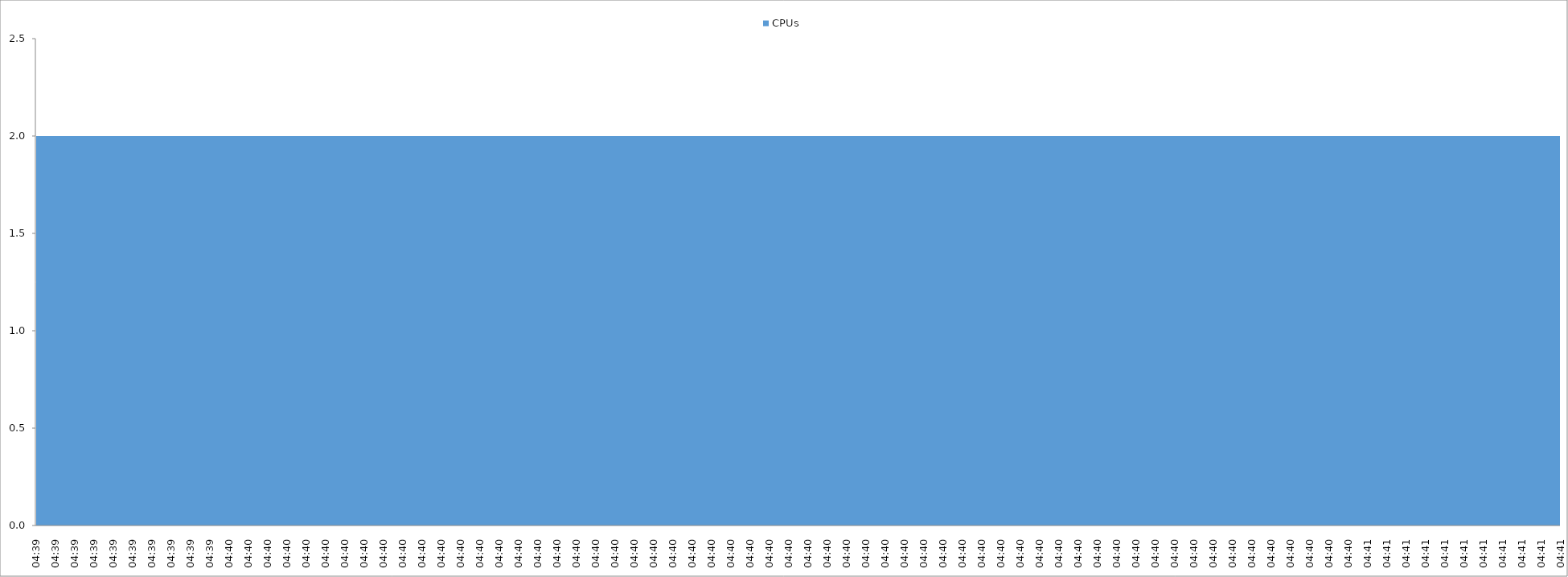
| Category | CPUs |
|---|---|
| 04:39 | 2 |
| 04:39 | 2 |
| 04:39 | 2 |
| 04:39 | 2 |
| 04:39 | 2 |
| 04:39 | 2 |
| 04:39 | 2 |
| 04:39 | 2 |
| 04:39 | 2 |
| 04:39 | 2 |
| 04:40 | 2 |
| 04:40 | 2 |
| 04:40 | 2 |
| 04:40 | 2 |
| 04:40 | 2 |
| 04:40 | 2 |
| 04:40 | 2 |
| 04:40 | 2 |
| 04:40 | 2 |
| 04:40 | 2 |
| 04:40 | 2 |
| 04:40 | 2 |
| 04:40 | 2 |
| 04:40 | 2 |
| 04:40 | 2 |
| 04:40 | 2 |
| 04:40 | 2 |
| 04:40 | 2 |
| 04:40 | 2 |
| 04:40 | 2 |
| 04:40 | 2 |
| 04:40 | 2 |
| 04:40 | 2 |
| 04:40 | 2 |
| 04:40 | 2 |
| 04:40 | 2 |
| 04:40 | 2 |
| 04:40 | 2 |
| 04:40 | 2 |
| 04:40 | 2 |
| 04:40 | 2 |
| 04:40 | 2 |
| 04:40 | 2 |
| 04:40 | 2 |
| 04:40 | 2 |
| 04:40 | 2 |
| 04:40 | 2 |
| 04:40 | 2 |
| 04:40 | 2 |
| 04:40 | 2 |
| 04:40 | 2 |
| 04:40 | 2 |
| 04:40 | 2 |
| 04:40 | 2 |
| 04:40 | 2 |
| 04:40 | 2 |
| 04:40 | 2 |
| 04:40 | 2 |
| 04:40 | 2 |
| 04:40 | 2 |
| 04:40 | 2 |
| 04:40 | 2 |
| 04:40 | 2 |
| 04:40 | 2 |
| 04:40 | 2 |
| 04:40 | 2 |
| 04:40 | 2 |
| 04:40 | 2 |
| 04:40 | 2 |
| 04:41 | 2 |
| 04:41 | 2 |
| 04:41 | 2 |
| 04:41 | 2 |
| 04:41 | 2 |
| 04:41 | 2 |
| 04:41 | 2 |
| 04:41 | 2 |
| 04:41 | 2 |
| 04:41 | 2 |
| 04:41 | 2 |